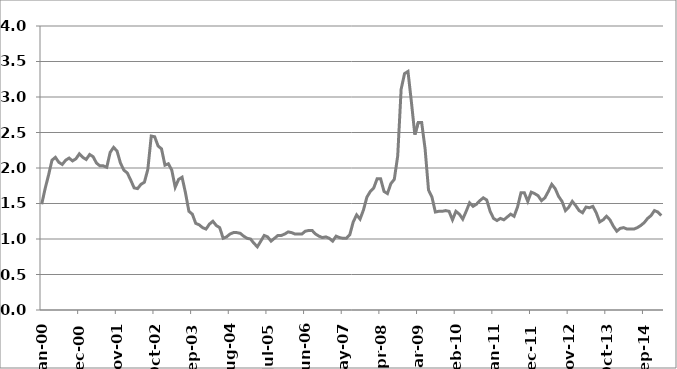
| Category | Series 1 |
|---|---|
| 2000-01-01 | 1.49 |
| 2000-02-01 | 1.71 |
| 2000-03-01 | 1.9 |
| 2000-04-01 | 2.11 |
| 2000-05-01 | 2.15 |
| 2000-06-01 | 2.08 |
| 2000-07-01 | 2.05 |
| 2000-08-01 | 2.11 |
| 2000-09-01 | 2.14 |
| 2000-10-01 | 2.1 |
| 2000-11-01 | 2.13 |
| 2000-12-01 | 2.2 |
| 2001-01-01 | 2.15 |
| 2001-02-01 | 2.12 |
| 2001-03-01 | 2.19 |
| 2001-04-01 | 2.16 |
| 2001-05-01 | 2.07 |
| 2001-06-01 | 2.03 |
| 2001-07-01 | 2.03 |
| 2001-08-01 | 2.01 |
| 2001-09-01 | 2.22 |
| 2001-10-01 | 2.29 |
| 2001-11-01 | 2.24 |
| 2001-12-01 | 2.07 |
| 2002-01-01 | 1.97 |
| 2002-02-01 | 1.93 |
| 2002-03-01 | 1.83 |
| 2002-04-01 | 1.72 |
| 2002-05-01 | 1.71 |
| 2002-06-01 | 1.77 |
| 2002-07-01 | 1.8 |
| 2002-08-01 | 1.98 |
| 2002-09-01 | 2.45 |
| 2002-10-01 | 2.44 |
| 2002-11-01 | 2.31 |
| 2002-12-01 | 2.27 |
| 2003-01-01 | 2.04 |
| 2003-02-01 | 2.06 |
| 2003-03-01 | 1.97 |
| 2003-04-01 | 1.73 |
| 2003-05-01 | 1.84 |
| 2003-06-01 | 1.87 |
| 2003-07-01 | 1.65 |
| 2003-08-01 | 1.39 |
| 2003-09-01 | 1.35 |
| 2003-10-01 | 1.22 |
| 2003-11-01 | 1.2 |
| 2003-12-01 | 1.16 |
| 2004-01-01 | 1.14 |
| 2004-02-01 | 1.21 |
| 2004-03-01 | 1.25 |
| 2004-04-01 | 1.19 |
| 2004-05-01 | 1.16 |
| 2004-06-01 | 1.01 |
| 2004-07-01 | 1.03 |
| 2004-08-01 | 1.07 |
| 2004-09-01 | 1.09 |
| 2004-10-01 | 1.09 |
| 2004-11-01 | 1.08 |
| 2004-12-01 | 1.04 |
| 2005-01-01 | 1.01 |
| 2005-02-01 | 1 |
| 2005-03-01 | 0.94 |
| 2005-04-01 | 0.89 |
| 2005-05-01 | 0.97 |
| 2005-06-01 | 1.05 |
| 2005-07-01 | 1.03 |
| 2005-08-01 | 0.97 |
| 2005-09-01 | 1.01 |
| 2005-10-01 | 1.05 |
| 2005-11-01 | 1.05 |
| 2005-12-01 | 1.07 |
| 2006-01-01 | 1.1 |
| 2006-02-01 | 1.09 |
| 2006-03-01 | 1.07 |
| 2006-04-01 | 1.07 |
| 2006-05-01 | 1.07 |
| 2006-06-01 | 1.11 |
| 2006-07-01 | 1.12 |
| 2006-08-01 | 1.12 |
| 2006-09-01 | 1.07 |
| 2006-10-01 | 1.04 |
| 2006-11-01 | 1.02 |
| 2006-12-01 | 1.03 |
| 2007-01-01 | 1.01 |
| 2007-02-01 | 0.97 |
| 2007-03-01 | 1.04 |
| 2007-04-01 | 1.02 |
| 2007-05-01 | 1.01 |
| 2007-06-01 | 1.01 |
| 2007-07-01 | 1.06 |
| 2007-08-01 | 1.24 |
| 2007-09-01 | 1.34 |
| 2007-10-01 | 1.28 |
| 2007-11-01 | 1.41 |
| 2007-12-01 | 1.59 |
| 2008-01-01 | 1.67 |
| 2008-02-01 | 1.72 |
| 2008-03-01 | 1.85 |
| 2008-04-01 | 1.85 |
| 2008-05-01 | 1.67 |
| 2008-06-01 | 1.64 |
| 2008-07-01 | 1.78 |
| 2008-08-01 | 1.84 |
| 2008-09-01 | 2.17 |
| 2008-10-01 | 3.11 |
| 2008-11-01 | 3.33 |
| 2008-12-01 | 3.36 |
| 2009-01-01 | 2.93 |
| 2009-02-01 | 2.47 |
| 2009-03-01 | 2.64 |
| 2009-04-01 | 2.64 |
| 2009-05-01 | 2.27 |
| 2009-06-01 | 1.69 |
| 2009-07-01 | 1.59 |
| 2009-08-01 | 1.38 |
| 2009-09-01 | 1.39 |
| 2009-10-01 | 1.39 |
| 2009-11-01 | 1.4 |
| 2009-12-01 | 1.39 |
| 2010-01-01 | 1.27 |
| 2010-02-01 | 1.39 |
| 2010-03-01 | 1.35 |
| 2010-04-01 | 1.28 |
| 2010-05-01 | 1.39 |
| 2010-06-01 | 1.51 |
| 2010-07-01 | 1.46 |
| 2010-08-01 | 1.49 |
| 2010-09-01 | 1.54 |
| 2010-10-01 | 1.58 |
| 2010-11-01 | 1.55 |
| 2010-12-01 | 1.39 |
| 2011-01-01 | 1.29 |
| 2011-02-01 | 1.26 |
| 2011-03-01 | 1.29 |
| 2011-04-01 | 1.27 |
| 2011-05-01 | 1.31 |
| 2011-06-01 | 1.35 |
| 2011-07-01 | 1.32 |
| 2011-08-01 | 1.45 |
| 2011-09-01 | 1.65 |
| 2011-10-01 | 1.65 |
| 2011-11-01 | 1.53 |
| 2011-12-01 | 1.66 |
| 2012-01-01 | 1.64 |
| 2012-02-01 | 1.61 |
| 2012-03-01 | 1.54 |
| 2012-04-01 | 1.58 |
| 2012-05-01 | 1.67 |
| 2012-06-01 | 1.77 |
| 2012-07-01 | 1.71 |
| 2012-08-01 | 1.6 |
| 2012-09-01 | 1.53 |
| 2012-10-01 | 1.4 |
| 2012-11-01 | 1.45 |
| 2012-12-01 | 1.53 |
| 2013-01-01 | 1.47 |
| 2013-02-01 | 1.4 |
| 2013-03-01 | 1.37 |
| 2013-04-01 | 1.45 |
| 2013-05-01 | 1.44 |
| 2013-06-01 | 1.46 |
| 2013-07-01 | 1.37 |
| 2013-08-01 | 1.24 |
| 2013-09-01 | 1.27 |
| 2013-10-01 | 1.32 |
| 2013-11-01 | 1.27 |
| 2013-12-01 | 1.18 |
| 2014-01-01 | 1.11 |
| 2014-02-01 | 1.15 |
| 2014-03-01 | 1.16 |
| 2014-04-01 | 1.14 |
| 2014-05-01 | 1.14 |
| 2014-06-01 | 1.14 |
| 2014-07-01 | 1.16 |
| 2014-08-01 | 1.19 |
| 2014-09-01 | 1.23 |
| 2014-10-01 | 1.29 |
| 2014-11-01 | 1.33 |
| 2014-12-01 | 1.4 |
| 2015-01-01 | 1.38 |
| 2015-02-01 | 1.33 |